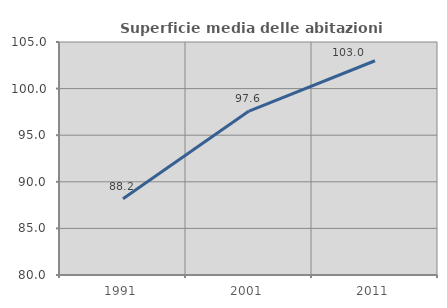
| Category | Superficie media delle abitazioni occupate |
|---|---|
| 1991.0 | 88.181 |
| 2001.0 | 97.586 |
| 2011.0 | 102.988 |